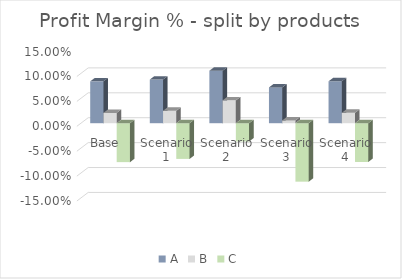
| Category | A | B | C |
|---|---|---|---|
| Base | 0.084 | 0.021 | -0.078 |
| Scenario 1 | 0.088 | 0.025 | -0.072 |
| Scenario 2 | 0.105 | 0.046 | -0.037 |
| Scenario 3 | 0.072 | 0.006 | -0.117 |
| Scenario 4 | 0.084 | 0.021 | -0.078 |